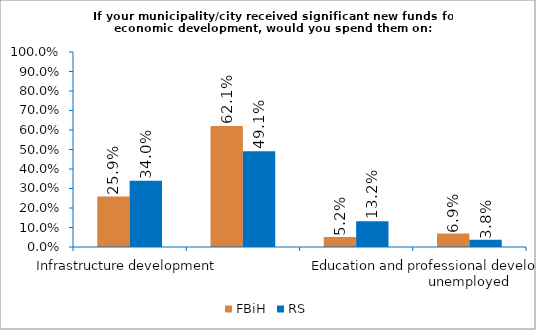
| Category | FBiH | RS |
|---|---|---|
| Infrastructure development | 0.259 | 0.34 |
| Business zones for attracting foreign investments | 0.621 | 0.491 |
| Incentives for local entrepreneurs | 0.052 | 0.132 |
| Education and professional development of the unemployed | 0.069 | 0.038 |